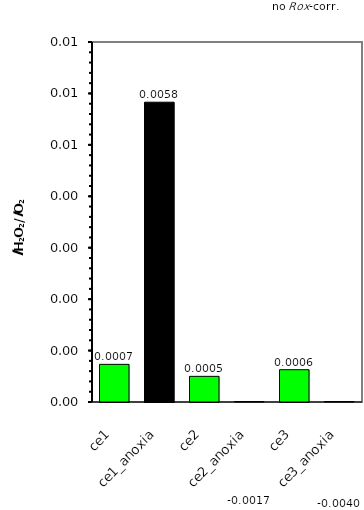
| Category | ce1 |
|---|---|
| ce1 | 0.001 |
| ce1_anoxia | 0.006 |
| ce2 | 0 |
| ce2_anoxia | -0.002 |
| ce3 | 0.001 |
| ce3_anoxia | -0.004 |